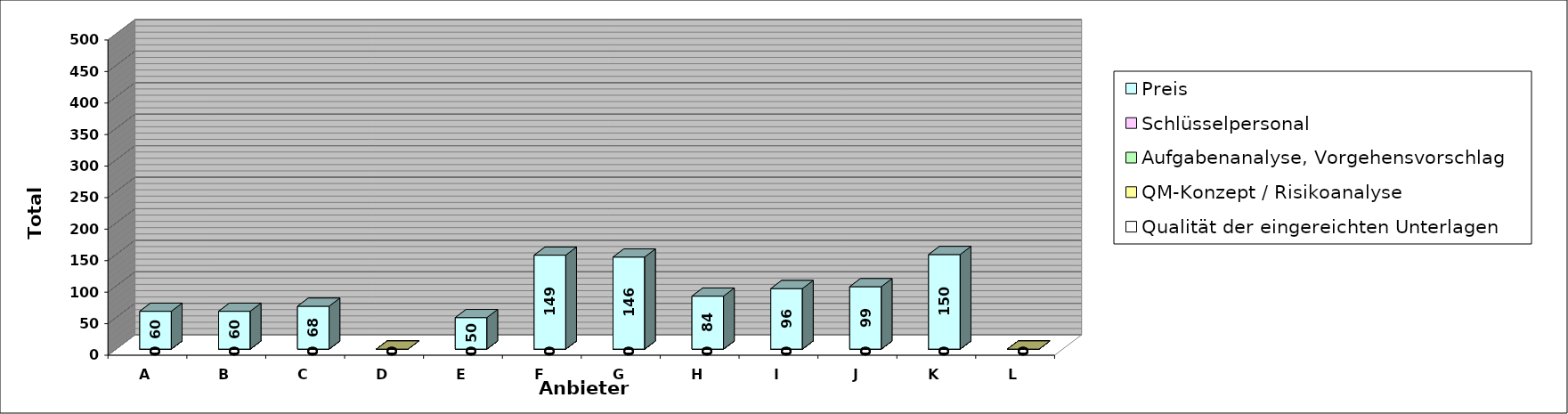
| Category | Qualität der eingereichten Unterlagen | QM-Konzept / Risikoanalyse | Aufgabenanalyse, Vorgehensvorschlag | Schlüsselpersonal | Preis |
|---|---|---|---|---|---|
| A | 0 | 0 | 0 | 0 | 60 |
| B | 0 | 0 | 0 | 0 | 60 |
| C | 0 | 0 | 0 | 0 | 68 |
| D | 0 | 0 | 0 | 0 | 0 |
| E | 0 | 0 | 0 | 0 | 50 |
| F | 0 | 0 | 0 | 0 | 149 |
| G | 0 | 0 | 0 | 0 | 146 |
| H | 0 | 0 | 0 | 0 | 84 |
| I | 0 | 0 | 0 | 0 | 96 |
| J | 0 | 0 | 0 | 0 | 99 |
| K | 0 | 0 | 0 | 0 | 150 |
| L | 0 | 0 | 0 | 0 | 0 |